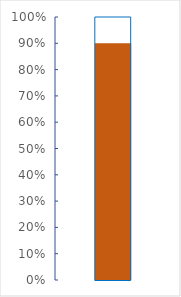
| Category | Excellent | Good | Bad | Target |
|---|---|---|---|---|
| 0 | 0.9 | 0 | 0 | 1 |